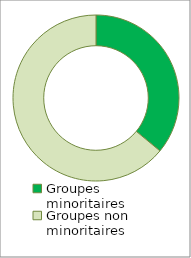
| Category | Series 0 |
|---|---|
| Groupes minoritaires | 0.36 |
| Groupes non minoritaires | 0.64 |